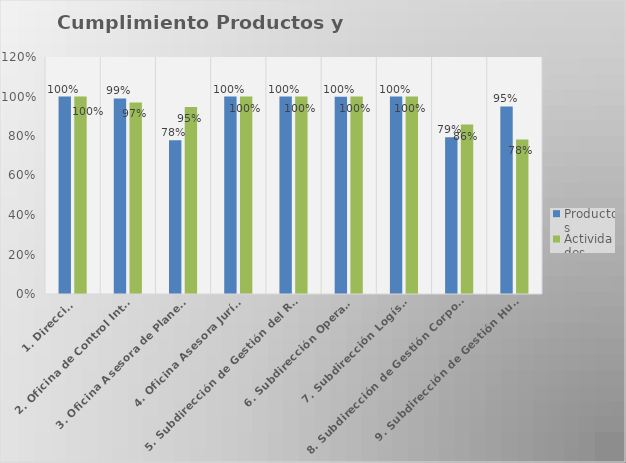
| Category | Productos | Actividades |
|---|---|---|
| 1. Dirección | 1 | 1 |
| 2. Oficina de Control Interno | 0.99 | 0.97 |
| 3. Oficina Asesora de Planeación | 0.778 | 0.946 |
| 4. Oficina Asesora Jurídica | 1 | 1 |
| 5. Subdirección de Gestión del Riesgo | 1 | 1 |
| 6. Subdirección Operativa | 0.998 | 1 |
| 7. Subdirección Logística | 1 | 1 |
| 8. Subdirección de Gestión Corporativa | 0.794 | 0.858 |
| 9. Subdirección de Gestión Humana | 0.95 | 0.783 |